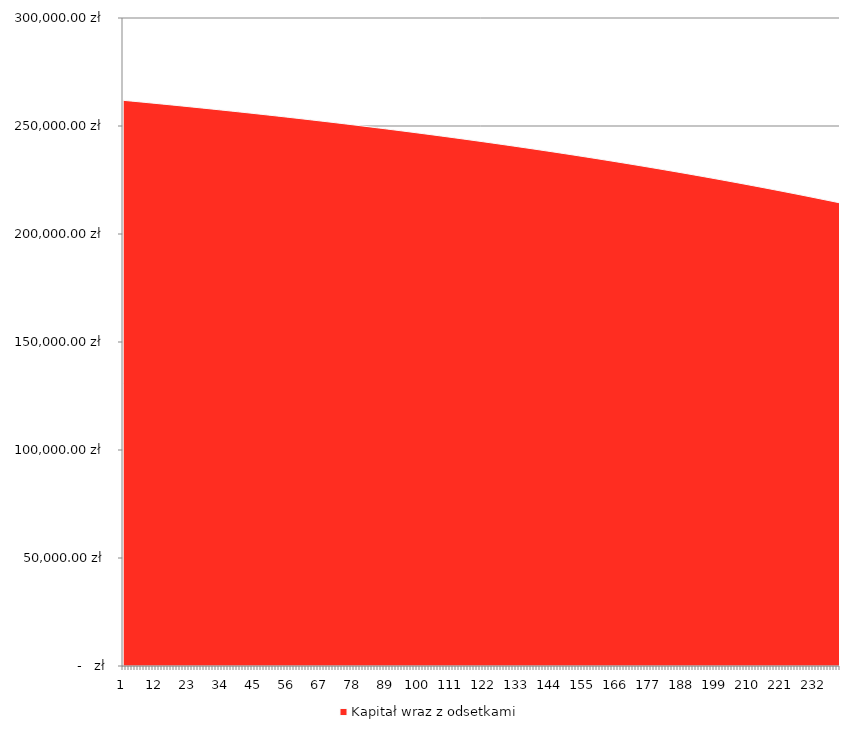
| Category | Kapitał wraz z odsetkami |
|---|---|
| 0 | 261905.316 |
| 1 | 261775 |
| 2 | 261644.25 |
| 3 | 261513.064 |
| 4 | 261381.441 |
| 5 | 261249.379 |
| 6 | 261116.877 |
| 7 | 260983.933 |
| 8 | 260850.546 |
| 9 | 260716.715 |
| 10 | 260582.437 |
| 11 | 260447.712 |
| 12 | 260312.538 |
| 13 | 260176.913 |
| 14 | 260040.836 |
| 15 | 259904.305 |
| 16 | 259767.32 |
| 17 | 259629.878 |
| 18 | 259491.977 |
| 19 | 259353.617 |
| 20 | 259214.796 |
| 21 | 259075.512 |
| 22 | 258935.763 |
| 23 | 258795.549 |
| 24 | 258654.868 |
| 25 | 258513.717 |
| 26 | 258372.096 |
| 27 | 258230.003 |
| 28 | 258087.437 |
| 29 | 257944.395 |
| 30 | 257800.876 |
| 31 | 257656.879 |
| 32 | 257512.402 |
| 33 | 257367.443 |
| 34 | 257222.002 |
| 35 | 257076.075 |
| 36 | 256929.662 |
| 37 | 256782.761 |
| 38 | 256635.37 |
| 39 | 256487.488 |
| 40 | 256339.113 |
| 41 | 256190.243 |
| 42 | 256040.877 |
| 43 | 255891.013 |
| 44 | 255740.65 |
| 45 | 255589.786 |
| 46 | 255438.418 |
| 47 | 255286.546 |
| 48 | 255134.168 |
| 49 | 254981.282 |
| 50 | 254827.886 |
| 51 | 254673.979 |
| 52 | 254519.559 |
| 53 | 254364.624 |
| 54 | 254209.173 |
| 55 | 254053.204 |
| 56 | 253896.714 |
| 57 | 253739.704 |
| 58 | 253582.169 |
| 59 | 253424.11 |
| 60 | 253265.523 |
| 61 | 253106.409 |
| 62 | 252946.763 |
| 63 | 252786.586 |
| 64 | 252625.874 |
| 65 | 252464.627 |
| 66 | 252302.843 |
| 67 | 252140.519 |
| 68 | 251977.654 |
| 69 | 251814.246 |
| 70 | 251650.294 |
| 71 | 251485.795 |
| 72 | 251320.747 |
| 73 | 251155.15 |
| 74 | 250989 |
| 75 | 250822.297 |
| 76 | 250655.038 |
| 77 | 250487.221 |
| 78 | 250318.845 |
| 79 | 250149.908 |
| 80 | 249980.408 |
| 81 | 249810.343 |
| 82 | 249639.71 |
| 83 | 249468.509 |
| 84 | 249296.738 |
| 85 | 249124.394 |
| 86 | 248951.475 |
| 87 | 248777.98 |
| 88 | 248603.906 |
| 89 | 248429.253 |
| 90 | 248254.017 |
| 91 | 248078.197 |
| 92 | 247901.791 |
| 93 | 247724.797 |
| 94 | 247547.213 |
| 95 | 247369.037 |
| 96 | 247190.267 |
| 97 | 247010.901 |
| 98 | 246830.938 |
| 99 | 246650.374 |
| 100 | 246469.209 |
| 101 | 246287.439 |
| 102 | 246105.064 |
| 103 | 245922.081 |
| 104 | 245738.488 |
| 105 | 245554.283 |
| 106 | 245369.464 |
| 107 | 245184.029 |
| 108 | 244997.976 |
| 109 | 244811.302 |
| 110 | 244624.007 |
| 111 | 244436.087 |
| 112 | 244247.54 |
| 113 | 244058.365 |
| 114 | 243868.56 |
| 115 | 243678.122 |
| 116 | 243487.049 |
| 117 | 243295.339 |
| 118 | 243102.99 |
| 119 | 242910 |
| 120 | 242716.367 |
| 121 | 242522.088 |
| 122 | 242327.162 |
| 123 | 242131.585 |
| 124 | 241935.357 |
| 125 | 241738.475 |
| 126 | 241540.937 |
| 127 | 241342.74 |
| 128 | 241143.882 |
| 129 | 240944.362 |
| 130 | 240744.177 |
| 131 | 240543.324 |
| 132 | 240341.802 |
| 133 | 240139.608 |
| 134 | 239936.74 |
| 135 | 239733.195 |
| 136 | 239528.973 |
| 137 | 239324.069 |
| 138 | 239118.483 |
| 139 | 238912.211 |
| 140 | 238705.252 |
| 141 | 238497.603 |
| 142 | 238289.261 |
| 143 | 238080.226 |
| 144 | 237870.493 |
| 145 | 237660.061 |
| 146 | 237448.928 |
| 147 | 237237.091 |
| 148 | 237024.548 |
| 149 | 236811.297 |
| 150 | 236597.334 |
| 151 | 236382.659 |
| 152 | 236167.268 |
| 153 | 235951.159 |
| 154 | 235734.329 |
| 155 | 235516.777 |
| 156 | 235298.499 |
| 157 | 235079.494 |
| 158 | 234859.759 |
| 159 | 234639.292 |
| 160 | 234418.09 |
| 161 | 234196.15 |
| 162 | 233973.47 |
| 163 | 233750.049 |
| 164 | 233525.882 |
| 165 | 233300.968 |
| 166 | 233075.305 |
| 167 | 232848.889 |
| 168 | 232621.719 |
| 169 | 232393.791 |
| 170 | 232165.104 |
| 171 | 231935.654 |
| 172 | 231705.44 |
| 173 | 231474.458 |
| 174 | 231242.706 |
| 175 | 231010.182 |
| 176 | 230776.882 |
| 177 | 230542.805 |
| 178 | 230307.948 |
| 179 | 230072.308 |
| 180 | 229835.882 |
| 181 | 229598.669 |
| 182 | 229360.664 |
| 183 | 229121.866 |
| 184 | 228882.273 |
| 185 | 228641.88 |
| 186 | 228400.686 |
| 187 | 228158.689 |
| 188 | 227915.884 |
| 189 | 227672.271 |
| 190 | 227427.845 |
| 191 | 227182.604 |
| 192 | 226936.546 |
| 193 | 226689.668 |
| 194 | 226441.967 |
| 195 | 226193.44 |
| 196 | 225944.085 |
| 197 | 225693.899 |
| 198 | 225442.878 |
| 199 | 225191.021 |
| 200 | 224938.325 |
| 201 | 224684.786 |
| 202 | 224430.402 |
| 203 | 224175.17 |
| 204 | 223919.087 |
| 205 | 223662.151 |
| 206 | 223404.358 |
| 207 | 223145.706 |
| 208 | 222886.191 |
| 209 | 222625.812 |
| 210 | 222364.565 |
| 211 | 222102.447 |
| 212 | 221839.455 |
| 213 | 221575.586 |
| 214 | 221310.838 |
| 215 | 221045.208 |
| 216 | 220778.692 |
| 217 | 220511.287 |
| 218 | 220242.992 |
| 219 | 219973.802 |
| 220 | 219703.714 |
| 221 | 219432.727 |
| 222 | 219160.836 |
| 223 | 218888.038 |
| 224 | 218614.332 |
| 225 | 218339.713 |
| 226 | 218064.179 |
| 227 | 217787.726 |
| 228 | 217510.352 |
| 229 | 217232.053 |
| 230 | 216952.826 |
| 231 | 216672.669 |
| 232 | 216391.578 |
| 233 | 216109.55 |
| 234 | 215826.582 |
| 235 | 215542.67 |
| 236 | 215257.813 |
| 237 | 214972.005 |
| 238 | 214685.245 |
| 239 | 214397.53 |